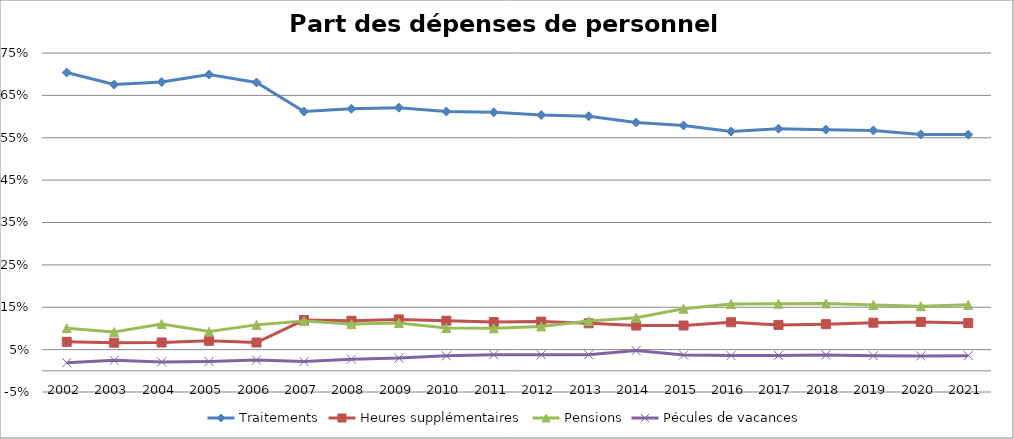
| Category | Traitements | Heures supplémentaires | Pensions | Pécules de vacances |
|---|---|---|---|---|
| 2002.0 | 0.704 | 0.068 | 0.101 | 0.019 |
| 2003.0 | 0.676 | 0.066 | 0.092 | 0.025 |
| 2004.0 | 0.681 | 0.067 | 0.111 | 0.021 |
| 2005.0 | 0.699 | 0.071 | 0.093 | 0.022 |
| 2006.0 | 0.68 | 0.067 | 0.108 | 0.025 |
| 2007.0 | 0.612 | 0.12 | 0.117 | 0.022 |
| 2008.0 | 0.618 | 0.118 | 0.11 | 0.028 |
| 2009.0 | 0.621 | 0.121 | 0.113 | 0.03 |
| 2010.0 | 0.612 | 0.118 | 0.101 | 0.035 |
| 2011.0 | 0.61 | 0.115 | 0.1 | 0.038 |
| 2012.0 | 0.604 | 0.116 | 0.105 | 0.038 |
| 2013.0 | 0.601 | 0.112 | 0.117 | 0.038 |
| 2014.0 | 0.586 | 0.107 | 0.125 | 0.048 |
| 2015.0 | 0.579 | 0.107 | 0.147 | 0.037 |
| 2016.0 | 0.565 | 0.115 | 0.157 | 0.036 |
| 2017.0 | 0.571 | 0.108 | 0.158 | 0.036 |
| 2018.0 | 0.569 | 0.11 | 0.159 | 0.038 |
| 2019.0 | 0.567 | 0.114 | 0.155 | 0.035 |
| 2020.0 | 0.558 | 0.115 | 0.153 | 0.035 |
| 2021.0 | 0.557 | 0.113 | 0.156 | 0.036 |